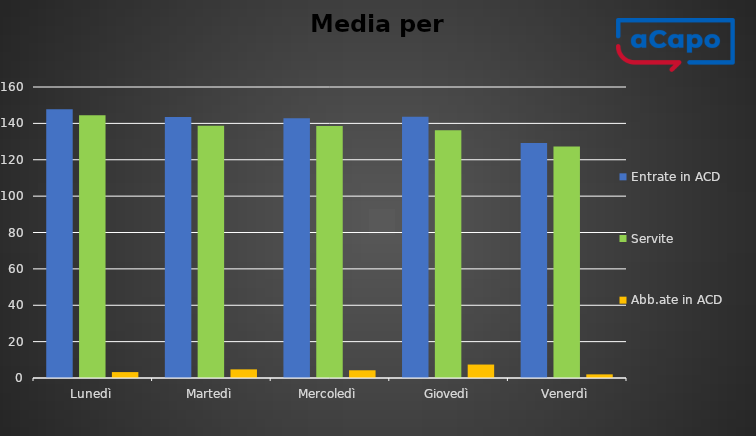
| Category | Entrate in ACD | Servite | Abb.ate in ACD |
|---|---|---|---|
| Lunedì | 147.75 | 144.5 | 3.25 |
| Martedì | 143.5 | 138.75 | 4.75 |
| Mercoledì | 142.75 | 138.5 | 4.25 |
| Giovedì | 143.6 | 136.2 | 7.4 |
| Venerdì | 129.25 | 127.25 | 2 |